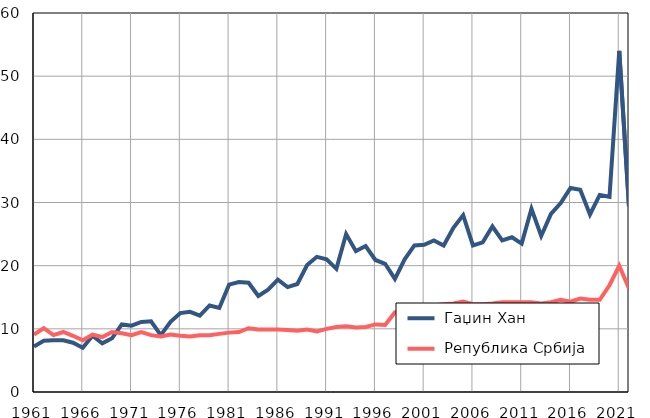
| Category |  Гаџин Хан |  Република Србија |
|---|---|---|
| 1961.0 | 7.2 | 9.1 |
| 1962.0 | 8.1 | 10.1 |
| 1963.0 | 8.2 | 9 |
| 1964.0 | 8.2 | 9.5 |
| 1965.0 | 7.8 | 8.9 |
| 1966.0 | 7 | 8.2 |
| 1967.0 | 8.9 | 9.1 |
| 1968.0 | 7.7 | 8.7 |
| 1969.0 | 8.5 | 9.5 |
| 1970.0 | 10.7 | 9.3 |
| 1971.0 | 10.5 | 9 |
| 1972.0 | 11.1 | 9.5 |
| 1973.0 | 11.2 | 9 |
| 1974.0 | 9 | 8.8 |
| 1975.0 | 11.1 | 9.1 |
| 1976.0 | 12.5 | 8.9 |
| 1977.0 | 12.7 | 8.8 |
| 1978.0 | 12.1 | 9 |
| 1979.0 | 13.7 | 9 |
| 1980.0 | 13.3 | 9.2 |
| 1981.0 | 17 | 9.4 |
| 1982.0 | 17.4 | 9.5 |
| 1983.0 | 17.3 | 10.1 |
| 1984.0 | 15.2 | 9.9 |
| 1985.0 | 16.2 | 9.9 |
| 1986.0 | 17.8 | 9.9 |
| 1987.0 | 16.6 | 9.8 |
| 1988.0 | 17.1 | 9.7 |
| 1989.0 | 20.1 | 9.9 |
| 1990.0 | 21.4 | 9.6 |
| 1991.0 | 21 | 10 |
| 1992.0 | 19.5 | 10.3 |
| 1993.0 | 25 | 10.4 |
| 1994.0 | 22.3 | 10.2 |
| 1995.0 | 23.1 | 10.3 |
| 1996.0 | 20.9 | 10.7 |
| 1997.0 | 20.3 | 10.6 |
| 1998.0 | 17.9 | 12.6 |
| 1999.0 | 21 | 12.9 |
| 2000.0 | 23.2 | 13.2 |
| 2001.0 | 23.3 | 12.6 |
| 2002.0 | 24 | 13.7 |
| 2003.0 | 23.2 | 13.9 |
| 2004.0 | 26 | 14 |
| 2005.0 | 28 | 14.3 |
| 2006.0 | 23.2 | 13.9 |
| 2007.0 | 23.7 | 13.9 |
| 2008.0 | 26.2 | 14 |
| 2009.0 | 24 | 14.2 |
| 2010.0 | 24.5 | 14.2 |
| 2011.0 | 23.5 | 14.2 |
| 2012.0 | 29 | 14.2 |
| 2013.0 | 24.7 | 14 |
| 2014.0 | 28.2 | 14.2 |
| 2015.0 | 29.9 | 14.6 |
| 2016.0 | 32.3 | 14.3 |
| 2017.0 | 32 | 14.8 |
| 2018.0 | 28.1 | 14.6 |
| 2019.0 | 31.2 | 14.6 |
| 2020.0 | 30.9 | 16.9 |
| 2021.0 | 54 | 20 |
| 2022.0 | 29.4 | 16.4 |